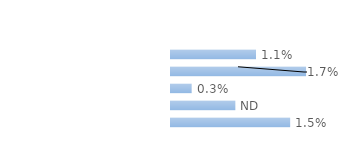
| Category | Series 0 |
|---|---|
| Personnes en emploi¹ | 0.011 |
| Chômeuses | 0.017 |
| Retraitées | 0.003 |
| Étudiantes, élèves | 0.008 |
| Autres inactifs  | 0.015 |